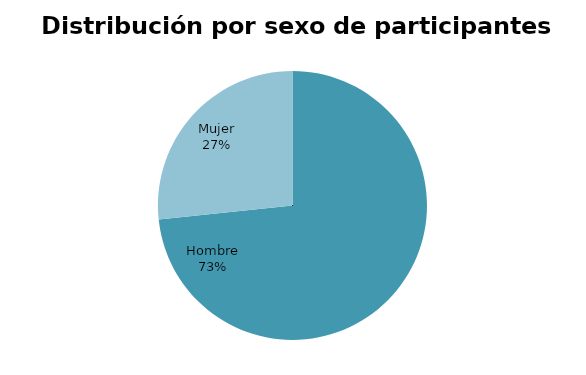
| Category | Series 0 |
|---|---|
| Hombre | 22 |
| Mujer | 8 |